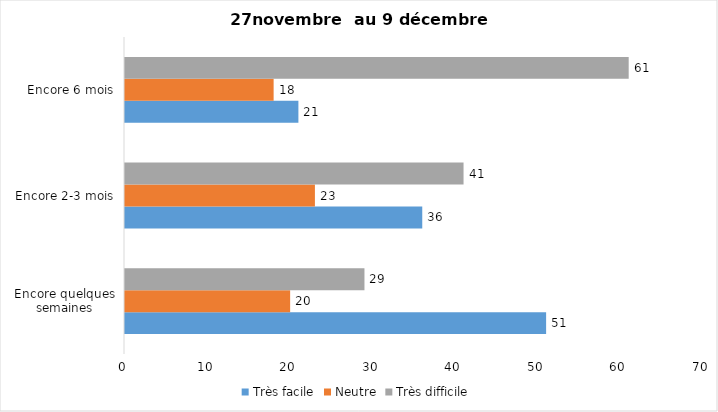
| Category | Très facile | Neutre | Très difficile |
|---|---|---|---|
| Encore quelques semaines | 51 | 20 | 29 |
| Encore 2-3 mois | 36 | 23 | 41 |
| Encore 6 mois | 21 | 18 | 61 |